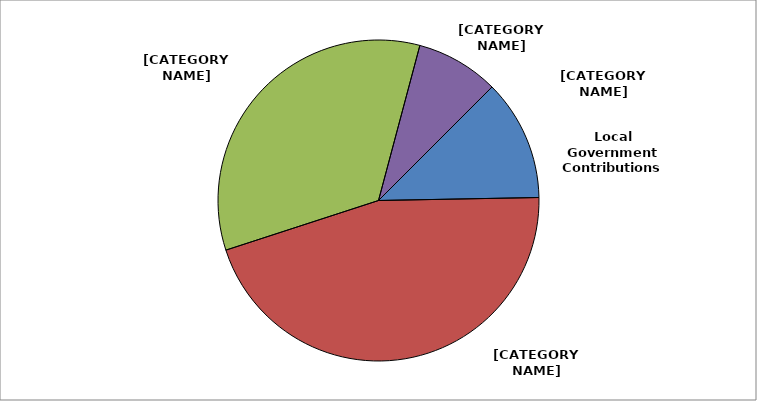
| Category | Series 0 |
|---|---|
| Local Government Contributions | 0.122 |
| Licenses, Permits & Fees | 0.454 |
| State Funded Expenditures | 0.343 |
| Federal Funded Expenditures | 0.084 |
| Other Funded Expenditures | 0 |